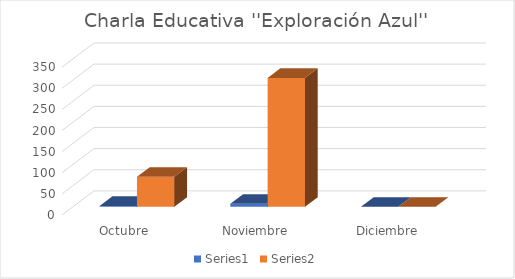
| Category | Series 0 | Series 1 |
|---|---|---|
| Octubre  | 2 | 71 |
| Noviembre  | 7 | 305 |
| Diciembre | 0 | 0 |